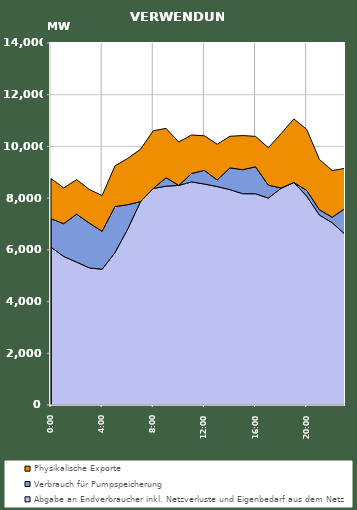
| Category | Abgabe an Endverbraucher inkl. Netzverluste und Eigenbedarf aus dem Netz | Verbrauch für Pumpspeicherung | Physikalische Exporte |
|---|---|---|---|
| 2007-01-17 | 6102.416 | 1099.948 | 1550.572 |
| 2007-01-17 01:00:00 | 5742.842 | 1267.626 | 1382.583 |
| 2007-01-17 02:00:00 | 5526.584 | 1853.682 | 1338.287 |
| 2007-01-17 03:00:00 | 5303.784 | 1727.038 | 1304.223 |
| 2007-01-17 04:00:00 | 5247.74 | 1472.404 | 1378.949 |
| 2007-01-17 05:00:00 | 5889.164 | 1785.993 | 1570.139 |
| 2007-01-17 06:00:00 | 6803.558 | 942.538 | 1789.518 |
| 2007-01-17 07:00:00 | 7863.111 | 2.322 | 2023.039 |
| 2007-01-17 08:00:00 | 8374.275 | 2.329 | 2228.298 |
| 2007-01-17 09:00:00 | 8461.891 | 328.995 | 1907.167 |
| 2007-01-17 10:00:00 | 8493.756 | 1.12 | 1676.114 |
| 2007-01-17 11:00:00 | 8628.837 | 324.706 | 1490.075 |
| 2007-01-17 12:00:00 | 8545.327 | 528.531 | 1335.792 |
| 2007-01-17 13:00:00 | 8448.179 | 256.248 | 1380.332 |
| 2007-01-17 14:00:00 | 8328.002 | 843.935 | 1222.11 |
| 2007-01-17 15:00:00 | 8171.809 | 927.476 | 1320.706 |
| 2007-01-17 16:00:00 | 8169.566 | 1044.098 | 1175.732 |
| 2007-01-17 17:00:00 | 8002.57 | 501.121 | 1446.576 |
| 2007-01-17 18:00:00 | 8380.333 | 11.99 | 2101.44 |
| 2007-01-17 19:00:00 | 8605.095 | 1.995 | 2456.39 |
| 2007-01-17 20:00:00 | 8082.024 | 218.707 | 2361.773 |
| 2007-01-17 21:00:00 | 7346.869 | 204.447 | 1943.134 |
| 2007-01-17 22:00:00 | 7049.423 | 211.156 | 1805.379 |
| 2007-01-17 23:00:00 | 6602.912 | 995.728 | 1555.132 |